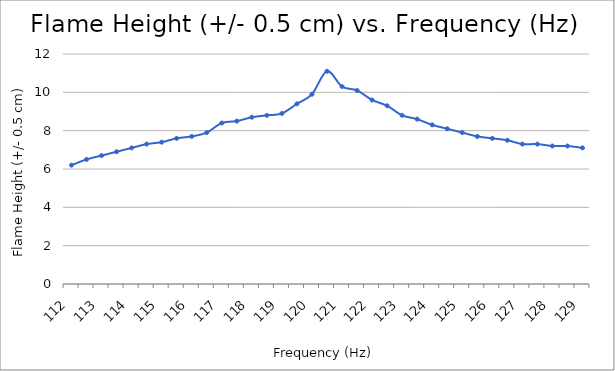
| Category | Flame Height (+/- 0.5 cm) |
|---|---|
| 112.0 | 6.2 |
| 112.5 | 6.5 |
| 113.0 | 6.7 |
| 113.5 | 6.9 |
| 114.0 | 7.1 |
| 114.5 | 7.3 |
| 115.0 | 7.4 |
| 115.5 | 7.6 |
| 116.0 | 7.7 |
| 116.5 | 7.9 |
| 117.0 | 8.4 |
| 117.5 | 8.5 |
| 118.0 | 8.7 |
| 118.5 | 8.8 |
| 119.0 | 8.9 |
| 119.5 | 9.4 |
| 120.0 | 9.9 |
| 120.5 | 11.1 |
| 121.0 | 10.3 |
| 121.5 | 10.1 |
| 122.0 | 9.6 |
| 122.5 | 9.3 |
| 123.0 | 8.8 |
| 123.5 | 8.6 |
| 124.0 | 8.3 |
| 124.5 | 8.1 |
| 125.0 | 7.9 |
| 125.5 | 7.7 |
| 126.0 | 7.6 |
| 126.5 | 7.5 |
| 127.0 | 7.3 |
| 127.5 | 7.3 |
| 128.0 | 7.2 |
| 128.5 | 7.2 |
| 129.0 | 7.1 |